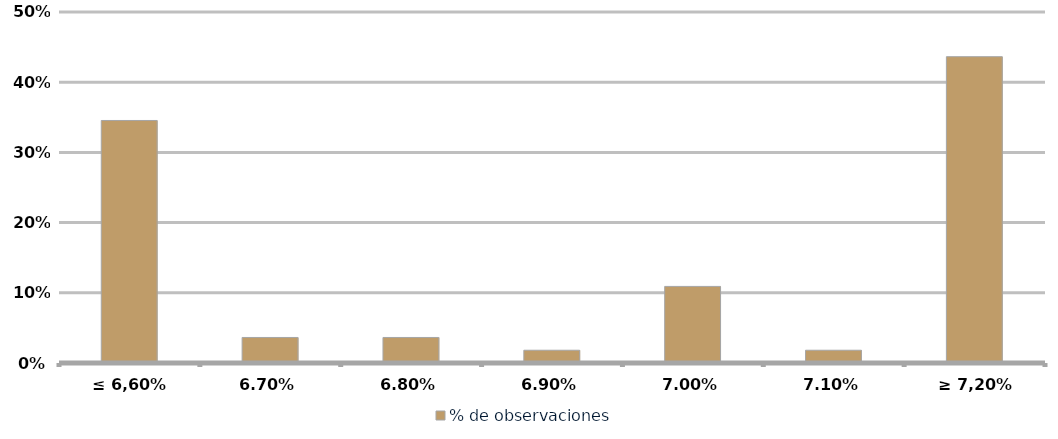
| Category | % de observaciones  |
|---|---|
| ≤ 6,60% | 0.345 |
| 6,70% | 0.036 |
| 6,80% | 0.036 |
| 6,90% | 0.018 |
| 7,00% | 0.109 |
| 7,10% | 0.018 |
| ≥ 7,20% | 0.436 |